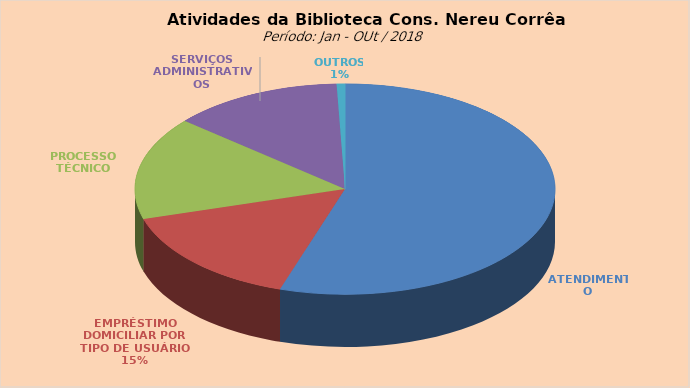
| Category | Series 0 |
|---|---|
| ATENDIMENTO | 12095 |
| EMPRÉSTIMO DOMICILIAR POR TIPO DE USUÁRIO | 3385 |
| PROCESSO TÉCNICO | 3481 |
| SERVIÇOS ADMINISTRATIVOS | 2888 |
| OUTROS | 141 |